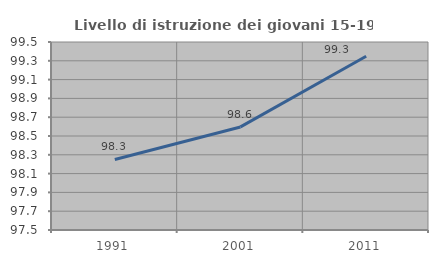
| Category | Livello di istruzione dei giovani 15-19 anni |
|---|---|
| 1991.0 | 98.251 |
| 2001.0 | 98.596 |
| 2011.0 | 99.349 |